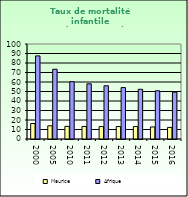
| Category | Maurice | Afrique                        |
|---|---|---|
| 2000.0 | 16.3 | 87.462 |
| 2005.0 | 13.9 | 73.418 |
| 2010.0 | 13.3 | 60.345 |
| 2011.0 | 13.2 | 58.107 |
| 2012.0 | 13.1 | 56.032 |
| 2013.0 | 13.1 | 54.131 |
| 2014.0 | 13.1 | 52.336 |
| 2015.0 | 12.7 | 50.754 |
| 2016.0 | 12.2 | 49.283 |